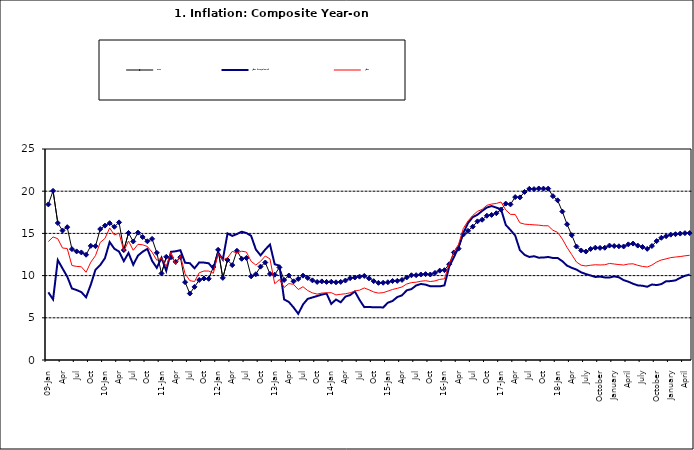
| Category | Food | All Items less Farm Produce | All Items |
|---|---|---|---|
| 09-Jan | 18.436 | 8.013 | 14.034 |
| Feb | 20.041 | 7.178 | 14.584 |
| Mar | 16.233 | 11.842 | 14.366 |
| Apr | 15.342 | 10.85 | 13.268 |
| May | 15.74 | 9.88 | 13.212 |
| June | 13.138 | 8.472 | 11.194 |
| Jul | 12.867 | 8.285 | 11.09 |
| Aug | 12.746 | 8.044 | 11.046 |
| Sep | 12.472 | 7.431 | 10.39 |
| Oct | 13.524 | 8.933 | 11.588 |
| Nov | 13.482 | 10.702 | 12.368 |
| Dec | 15.518 | 11.249 | 13.93 |
| 10-Jan | 15.918 | 12.063 | 14.398 |
| Feb | 16.208 | 13.978 | 15.649 |
| Mar | 15.79 | 13.184 | 14.812 |
| Apr | 16.306 | 12.844 | 15.044 |
| May | 13.023 | 11.711 | 12.915 |
| Jun | 15.053 | 12.686 | 14.099 |
| Jul | 14.043 | 11.287 | 13.002 |
| Aug | 15.09 | 12.366 | 13.702 |
| Sep | 14.57 | 12.83 | 13.65 |
| Oct | 14.065 | 13.168 | 13.45 |
| Nov | 14.351 | 11.746 | 12.766 |
| Dec | 12.701 | 10.917 | 11.815 |
| 11-Jan | 10.255 | 12.118 | 12.08 |
| Feb | 12.221 | 10.569 | 11.1 |
| Mar | 12.169 | 12.815 | 12.779 |
| Apr | 11.629 | 12.882 | 11.291 |
| May | 12.179 | 13.006 | 12.352 |
| Jun | 9.22 | 11.524 | 10.23 |
| Jul | 7.877 | 11.472 | 9.397 |
| Aug | 8.665 | 10.863 | 9.301 |
| Sep | 9.479 | 11.567 | 10.339 |
| Oct | 9.656 | 11.539 | 10.544 |
| Nov | 9.623 | 11.459 | 10.54 |
| Dec | 11.02 | 10.822 | 10.283 |
| 12-Jan | 13.053 | 12.748 | 12.626 |
| 12-Feb | 9.729 | 11.901 | 11.866 |
| 12-Mar | 11.848 | 14.995 | 12.111 |
| Apr | 11.246 | 14.703 | 12.866 |
| May | 12.942 | 14.926 | 12.688 |
| Jun | 11.991 | 15.199 | 12.892 |
| Jul | 12.093 | 15.045 | 12.797 |
| Aug | 9.91 | 14.714 | 11.689 |
| Sep | 10.164 | 13.101 | 11.253 |
| Oct | 11.064 | 12.398 | 11.693 |
| Nov | 11.553 | 13.092 | 12.32 |
| Dec | 10.199 | 13.685 | 11.981 |
| 13-Jan | 10.106 | 11.342 | 9.031 |
| Feb | 10.973 | 11.184 | 9.542 |
| Mar | 9.482 | 7.179 | 8.593 |
| Apr | 10.006 | 6.874 | 9.052 |
| May | 9.321 | 6.227 | 8.964 |
| Jun | 9.606 | 5.472 | 8.353 |
| Jul | 9.994 | 6.58 | 8.682 |
| Aug | 9.723 | 7.245 | 8.231 |
| Sep | 9.437 | 7.41 | 7.952 |
| Oct | 9.249 | 7.579 | 7.807 |
| Nov | 9.313 | 7.75 | 7.931 |
| Dec | 9.253 | 7.872 | 7.957 |
| 14-Jan | 9.271 | 6.648 | 7.977 |
| Feb | 9.207 | 7.166 | 7.707 |
| Mar | 9.254 | 6.836 | 7.783 |
| Apr | 9.414 | 7.508 | 7.851 |
| May | 9.698 | 7.693 | 7.965 |
| Jun | 9.776 | 8.122 | 8.167 |
| Jul | 9.878 | 7.116 | 8.281 |
| Aug | 9.959 | 6.264 | 8.534 |
| Sep | 9.676 | 6.278 | 8.317 |
| Oct | 9.343 | 6.252 | 8.06 |
| Nov | 9.144 | 6.255 | 7.927 |
| Dec | 9.152 | 6.225 | 7.978 |
| 15-Jan | 9.215 | 6.787 | 8.157 |
| Feb | 9.359 | 6.994 | 8.359 |
| Mar | 9.376 | 7.46 | 8.494 |
| Apr | 9.49 | 7.661 | 8.655 |
| May | 9.782 | 8.253 | 9.003 |
| Jun | 10.041 | 8.403 | 9.168 |
| Jul | 10.049 | 8.83 | 9.218 |
| Aug | 10.131 | 9.01 | 9.336 |
| Sep | 10.174 | 8.928 | 9.394 |
| Oct | 10.129 | 8.742 | 9.296 |
| Nov | 10.321 | 8.732 | 9.368 |
| Dec | 10.588 | 8.727 | 9.554 |
| 16-Jan | 10.642 | 8.841 | 9.617 |
| Feb | 11.348 | 11.041 | 11.379 |
| Mar | 12.745 | 12.17 | 12.775 |
| Apr | 13.194 | 13.352 | 13.721 |
| May | 14.861 | 15.054 | 15.577 |
| Jun | 15.302 | 16.224 | 16.48 |
| Jul | 15.799 | 16.929 | 17.127 |
| Aug | 16.427 | 17.208 | 17.609 |
| Sep | 16.622 | 17.666 | 17.852 |
| Oct | 17.09 | 18.067 | 18.33 |
| Nov | 17.191 | 18.241 | 18.476 |
| Dec | 17.388 | 18.052 | 18.547 |
| 17-Jan | 17.818 | 17.867 | 18.719 |
| Feb | 18.528 | 16.011 | 17.78 |
| Mar | 18.436 | 15.404 | 17.256 |
| Apr | 19.303 | 14.75 | 17.244 |
| May | 19.266 | 13.016 | 16.251 |
| Jun | 19.915 | 12.455 | 16.098 |
| Jul | 20.284 | 12.207 | 16.053 |
| Aug | 20.251 | 12.296 | 16.012 |
| Sep | 20.321 | 12.123 | 15.979 |
| Oct | 20.306 | 12.142 | 15.905 |
| Nov | 20.308 | 12.206 | 15.901 |
| Dec | 19.415 | 12.089 | 15.372 |
| 18-Jan | 18.919 | 12.09 | 15.127 |
| Feb | 17.588 | 11.707 | 14.33 |
| Mar | 16.08 | 11.181 | 13.337 |
| Apr | 14.799 | 10.92 | 12.482 |
| May | 13.448 | 10.71 | 11.608 |
| June | 12.977 | 10.387 | 11.231 |
| July | 12.85 | 10.183 | 11.142 |
| August | 13.158 | 10.015 | 11.227 |
| September | 13.309 | 9.838 | 11.284 |
| October | 13.277 | 9.882 | 11.259 |
| November | 13.301 | 9.787 | 11.281 |
| December | 13.559 | 9.771 | 11.442 |
| January | 13.505 | 9.91 | 11.374 |
| February | 13.473 | 9.8 | 11.306 |
| March | 13.451 | 9.461 | 11.251 |
| April | 13.701 | 9.28 | 11.372 |
| May | 13.794 | 9.033 | 11.396 |
| June | 13.558 | 8.841 | 11.217 |
| July | 13.392 | 8.798 | 11.084 |
| August | 13.17 | 8.678 | 11.016 |
| September | 13.507 | 8.945 | 11.244 |
| October | 14.088 | 8.876 | 11.607 |
| November | 14.482 | 8.993 | 11.854 |
| December | 14.667 | 9.331 | 11.982 |
| January | 14.849 | 9.349 | 12.132 |
| February | 14.904 | 9.434 | 12.199 |
| March | 14.977 | 9.732 | 12.257 |
| April | 15.026 | 9.979 | 12.341 |
| May | 15.036 | 10.12 | 12.404 |